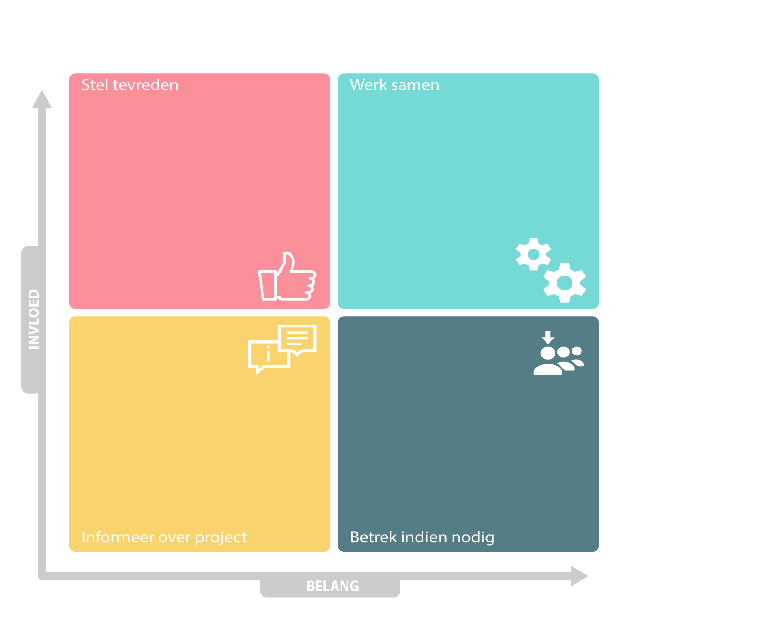
| Category | Organisaties |
|---|---|
| 0.0 | 0 |
| 0.0 | 0 |
| 0.0 | 0 |
| 0.0 | 0 |
| 0.0 | 0 |
| 0.0 | 0 |
| 0.0 | 0 |
| 0.0 | 0 |
| 0.0 | 0 |
| 0.0 | 0 |
| 0.0 | 0 |
| 0.0 | 0 |
| 0.0 | 0 |
| 0.0 | 0 |
| 0.0 | 0 |
| 0.0 | 0 |